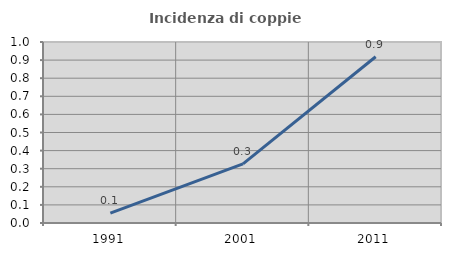
| Category | Incidenza di coppie miste |
|---|---|
| 1991.0 | 0.054 |
| 2001.0 | 0.327 |
| 2011.0 | 0.919 |